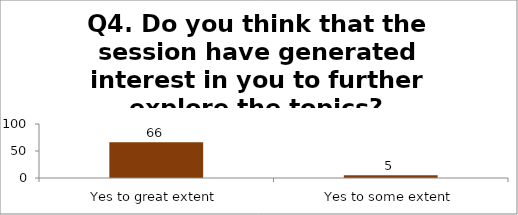
| Category | Q4. Do you think that the session have generated interest in you to further explore the topics? |
|---|---|
| Yes to great extent | 66 |
| Yes to some extent | 5 |